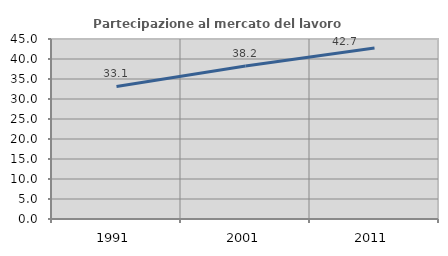
| Category | Partecipazione al mercato del lavoro  femminile |
|---|---|
| 1991.0 | 33.147 |
| 2001.0 | 38.242 |
| 2011.0 | 42.732 |